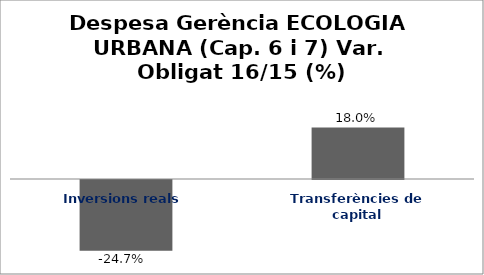
| Category | Series 0 |
|---|---|
| Inversions reals | -0.247 |
| Transferències de capital | 0.18 |